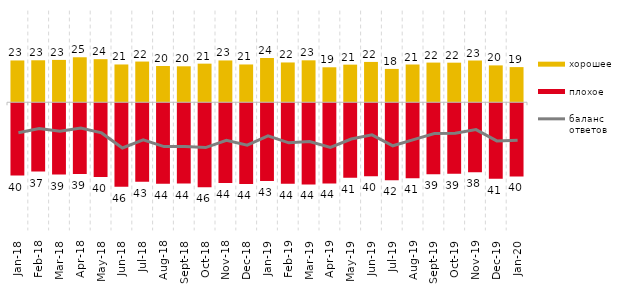
| Category | хорошее | плохое |
|---|---|---|
| 2018-01-01 | 22.9 | -39.6 |
| 2018-02-01 | 23 | -37.45 |
| 2018-03-01 | 23.2 | -39.1 |
| 2018-04-01 | 24.65 | -38.8 |
| 2018-05-01 | 23.6 | -40.4 |
| 2018-06-01 | 20.7 | -45.75 |
| 2018-07-01 | 22.3 | -42.95 |
| 2018-08-01 | 19.85 | -44.15 |
| 2018-09-01 | 19.7 | -44 |
| 2018-10-01 | 21.15 | -46 |
| 2018-11-01 | 22.904 | -43.713 |
| 2018-12-01 | 20.7 | -44.2 |
| 2019-01-01 | 24.25 | -42.65 |
| 2019-02-01 | 21.8 | -44.05 |
| 2019-03-01 | 22.974 | -44.455 |
| 2019-04-01 | 19.158 | -43.96 |
| 2019-05-01 | 20.604 | -40.763 |
| 2019-06-01 | 22.095 | -39.95 |
| 2019-07-01 | 18.267 | -42.129 |
| 2019-08-01 | 20.679 | -41.159 |
| 2019-09-01 | 21.733 | -38.911 |
| 2019-10-01 | 21.683 | -38.614 |
| 2019-11-01 | 22.871 | -37.871 |
| 2019-12-01 | 20.198 | -41.386 |
| 2020-01-01 | 19.257 | -40.099 |